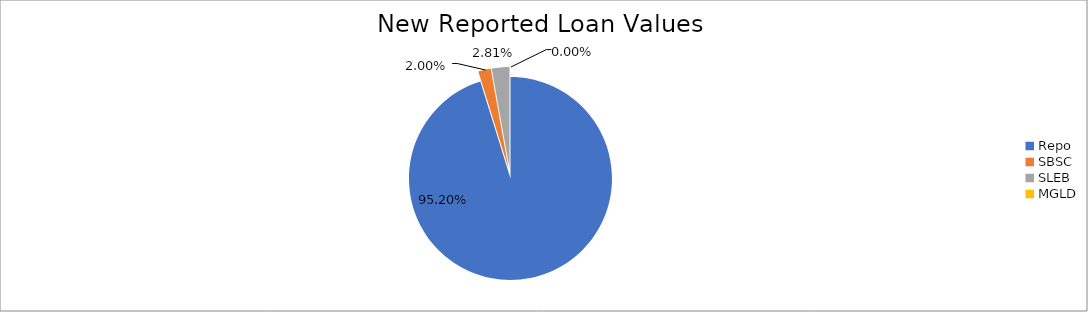
| Category | Series 0 |
|---|---|
| Repo | 11179353.34 |
| SBSC | 234619.679 |
| SLEB | 329641.582 |
| MGLD | 17.433 |